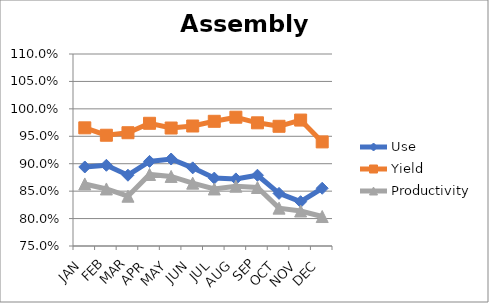
| Category | Use | Yield | Productivity |
|---|---|---|---|
| JAN | 0.894 | 0.965 | 0.863 |
| FEB | 0.897 | 0.952 | 0.854 |
| MAR | 0.879 | 0.956 | 0.841 |
| APR | 0.904 | 0.974 | 0.88 |
| MAY | 0.909 | 0.965 | 0.877 |
| JUN | 0.892 | 0.969 | 0.865 |
| JUL | 0.874 | 0.977 | 0.854 |
| AUG | 0.872 | 0.985 | 0.859 |
| SEP | 0.879 | 0.975 | 0.857 |
| OCT | 0.846 | 0.968 | 0.819 |
| NOV | 0.831 | 0.98 | 0.814 |
| DEC | 0.855 | 0.94 | 0.804 |